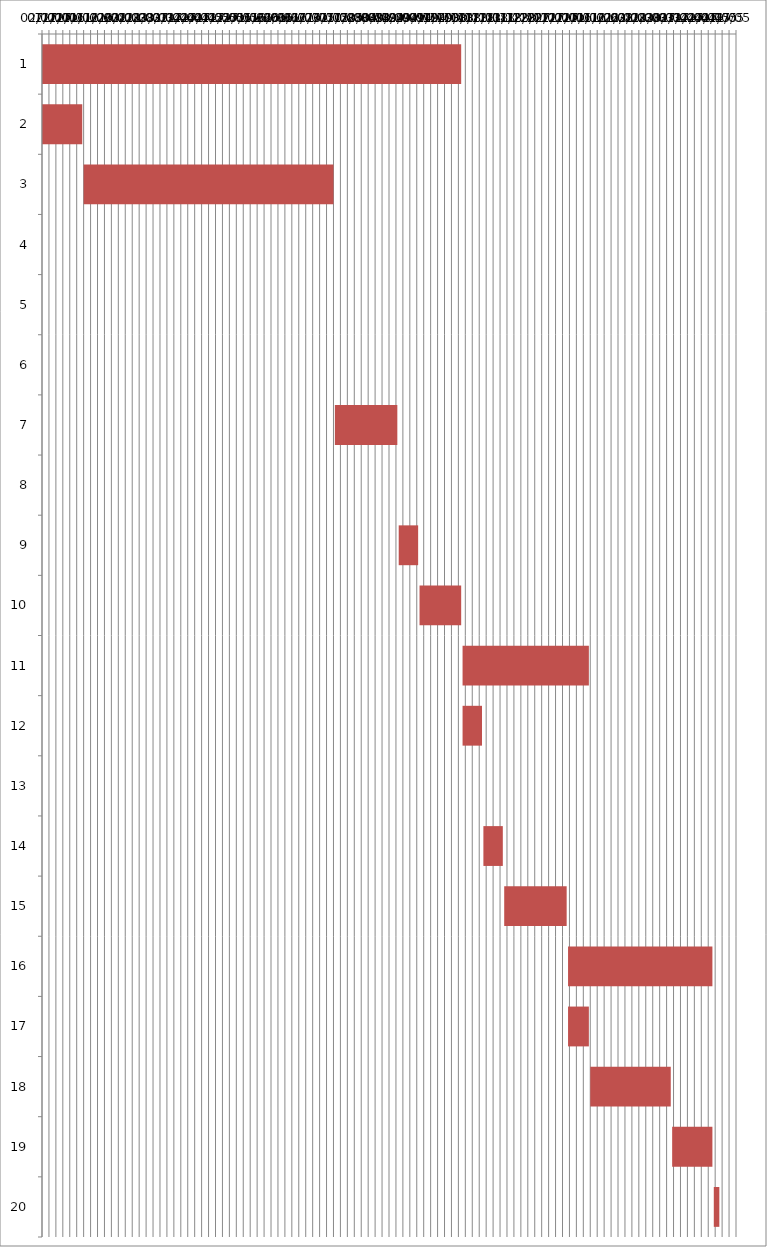
| Category | Fecha de inicio | DURACIÓN |
|---|---|---|
| 0 | 1/2/17 | 302 |
| 1 | 1/2/17 | 29 |
| 2 | 2/1/17 | 180 |
| 3 | 3/10/17 | 0 |
| 4 | 5/10/17 | 0 |
| 5 | 7/10/17 | 0 |
| 6 | 8/1/17 | 45 |
| 7 | 9/10/17 | 0 |
| 8 | 9/16/17 | 14 |
| 9 | 10/1/17 | 30 |
| 10 | 11/1/17 | 91 |
| 11 | 11/1/17 | 14 |
| 12 | 11/10/17 | 0 |
| 13 | 11/16/17 | 14 |
| 14 | 12/1/17 | 45 |
| 15 | 1/16/18 | 104 |
| 16 | 1/16/18 | 15 |
| 17 | 2/1/18 | 58 |
| 18 | 4/1/18 | 29 |
| 19 | 5/1/18 | 4 |